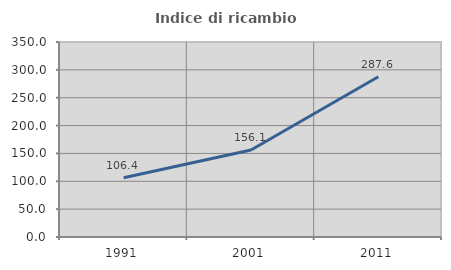
| Category | Indice di ricambio occupazionale  |
|---|---|
| 1991.0 | 106.369 |
| 2001.0 | 156.112 |
| 2011.0 | 287.571 |